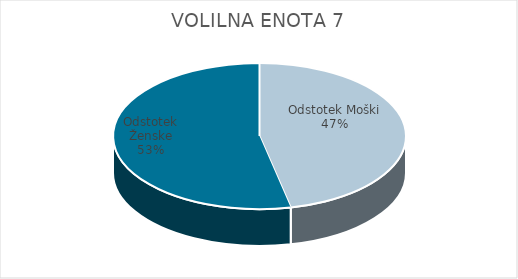
| Category | VOLILNA ENOTA 7 | #REF! | Slovenija skupaj |
|---|---|---|---|
| Odstotek Moški | 19.86 |  | 21.63 |
| Odstotek Ženske | 22.77 |  | 24.53 |